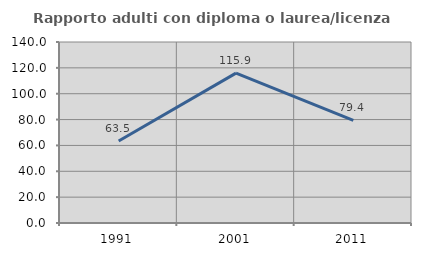
| Category | Rapporto adulti con diploma o laurea/licenza media  |
|---|---|
| 1991.0 | 63.465 |
| 2001.0 | 115.94 |
| 2011.0 | 79.4 |